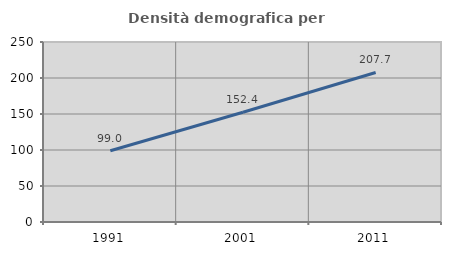
| Category | Densità demografica |
|---|---|
| 1991.0 | 99.017 |
| 2001.0 | 152.404 |
| 2011.0 | 207.669 |